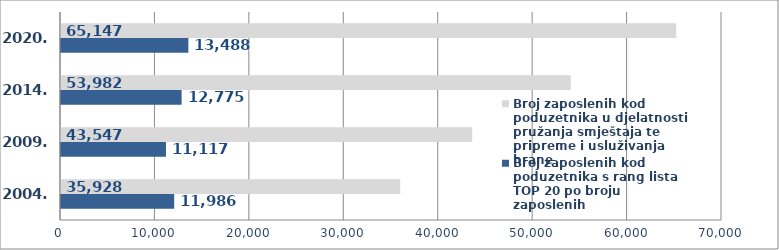
| Category | Broj zaposlenih kod poduzetnika s rang lista TOP 20 po broju zaposlenih  | Broj zaposlenih kod poduzetnika u djelatnosti pružanja smještaja te pripreme i usluživanja hrane |
|---|---|---|
| 2004. | 11986 | 35928 |
| 2009. | 11117 | 43547 |
| 2014. | 12775 | 53982 |
| 2020. | 13488 | 65147 |